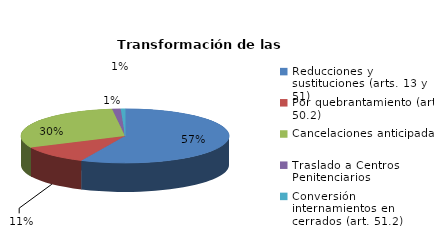
| Category | Series 0 |
|---|---|
| Reducciones y sustituciones (arts. 13 y 51) | 87 |
| Por quebrantamiento (art. 50.2) | 17 |
| Cancelaciones anticipadas | 46 |
| Traslado a Centros Penitenciarios | 2 |
| Conversión internamientos en cerrados (art. 51.2) | 1 |